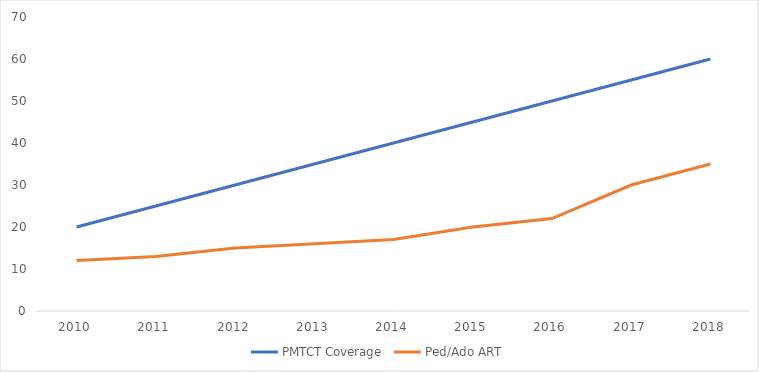
| Category | PMTCT Coverage | Ped/Ado ART |
|---|---|---|
| 2010.0 | 20 | 12 |
| 2011.0 | 25 | 13 |
| 2012.0 | 30 | 15 |
| 2013.0 | 35 | 16 |
| 2014.0 | 40 | 17 |
| 2015.0 | 45 | 20 |
| 2016.0 | 50 | 22 |
| 2017.0 | 55 | 30 |
| 2018.0 | 60 | 35 |